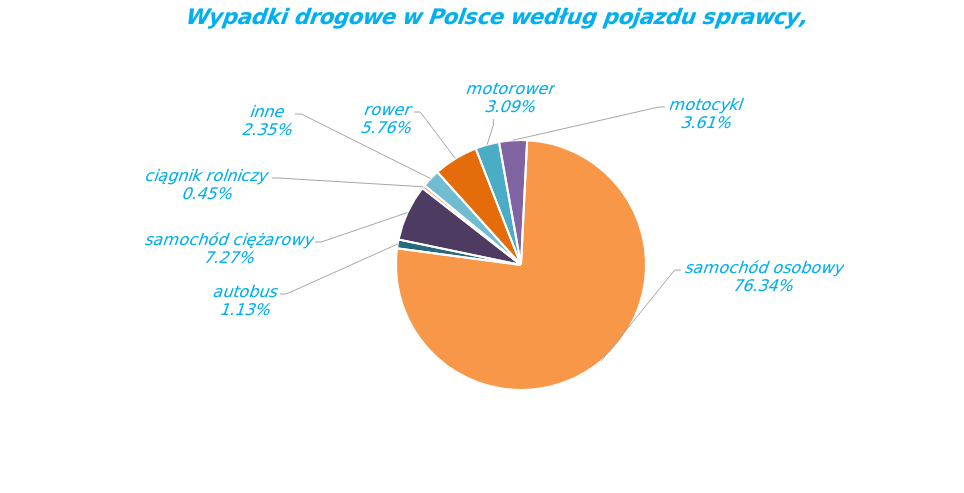
| Category | Series 0 |
|---|---|
| rower | 1854 |
| motorower | 994 |
| motocykl | 1160 |
| samochód osobowy | 24573 |
| autobus | 364 |
| samochód ciężarowy | 2341 |
| ciągnik rolniczy | 145 |
| inne | 757 |